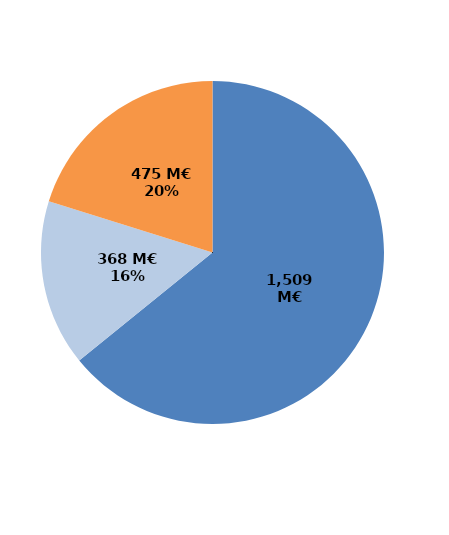
| Category | Series 0 |
|---|---|
| Formations certifiantes et pré-certifiantes | 1509.193 |
| Formations professionnalisantes | 368.31 |
| Formations d'insertion sociale et professionnelle | 474.562 |